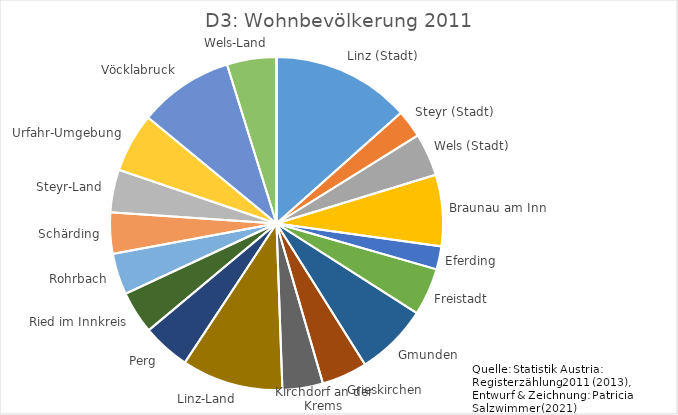
| Category | Wohnbevölkerung 2011 | Series 1 | Series 2 | Series 3 | Series 4 | Series 5 | Series 6 | Series 7 | Series 8 | Series 9 | Series 10 |
|---|---|---|---|---|---|---|---|---|---|---|---|
| Linz (Stadt) | 189889 |  |  |  |  |  |  |  |  |  |  |
| Steyr (Stadt) | 38205 |  |  |  |  |  |  |  |  |  |  |
| Wels (Stadt) | 58591 |  |  |  |  |  |  |  |  |  |  |
| Braunau am Inn | 97826 |  |  |  |  |  |  |  |  |  |  |
| Eferding | 31741 |  |  |  |  |  |  |  |  |  |  |
| Freistadt | 65113 |  |  |  |  |  |  |  |  |  |  |
| Gmunden | 99403 |  |  |  |  |  |  |  |  |  |  |
| Grieskirchen | 62555 |  |  |  |  |  |  |  |  |  |  |
| Kirchdorf an der Krems | 55557 |  |  |  |  |  |  |  |  |  |  |
| Linz-Land | 139116 |  |  |  |  |  |  |  |  |  |  |
| Perg | 65738 |  |  |  |  |  |  |  |  |  |  |
| Ried im Innkreis | 58553 |  |  |  |  |  |  |  |  |  |  |
| Rohrbach | 56688 |  |  |  |  |  |  |  |  |  |  |
| Schärding | 56426 |  |  |  |  |  |  |  |  |  |  |
| Steyr-Land | 58700 |  |  |  |  |  |  |  |  |  |  |
| Urfahr-Umgebung | 81400 |  |  |  |  |  |  |  |  |  |  |
| Vöcklabruck | 130316 |  |  |  |  |  |  |  |  |  |  |
| Wels-Land | 67945 |  |  |  |  |  |  |  |  |  |  |